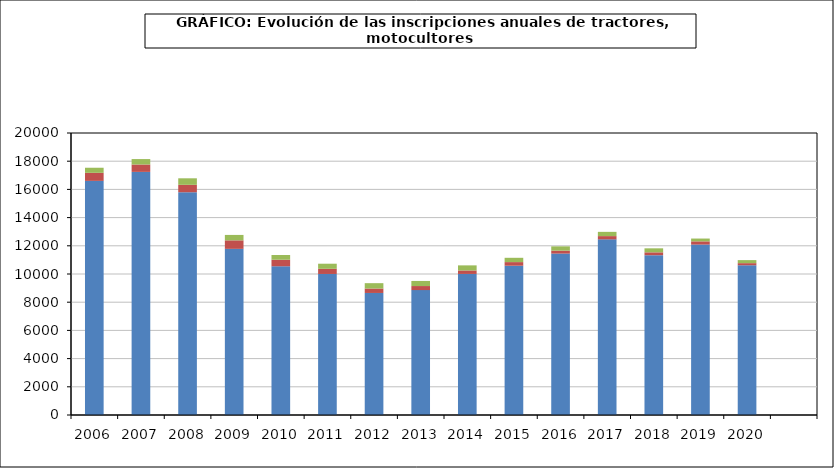
| Category | Series 0 | Series 1 | Series 2 |
|---|---|---|---|
| 2006.0 | 16605 | 570 | 361 |
| 2007.0 | 17241 | 525 | 385 |
| 2008.0 | 15799 | 525 | 463 |
| 2009.0 | 11784 | 603 | 384 |
| 2010.0 | 10548 | 463 | 336 |
| 2011.0 | 10002 | 366 | 362 |
| 2012.0 | 8655 | 315 | 380 |
| 2013.0 | 8859 | 287 | 361 |
| 2014.0 | 10004 | 248 | 360 |
| 2015.0 | 10587 | 257 | 305 |
| 2016.0 | 11449 | 209 | 302 |
| 2017.0 | 12457 | 231 | 301 |
| 2018.0 | 11333 | 204 | 284 |
| 2019.0 | 12087 | 228 | 200 |
| 2020.0 | 10620 | 150 | 215 |